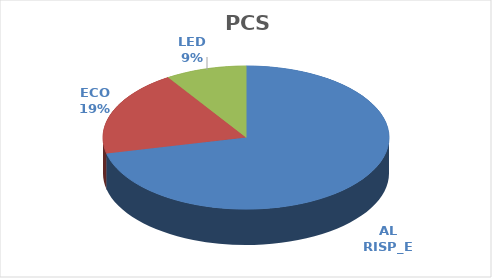
| Category |  PCS | Somma di TOT PRC |
|---|---|---|
| AL RISP_E | 27276 | 46952.882 |
| ECO | 7427 | 22340.759 |
| LED | 3500 | 21041.903 |